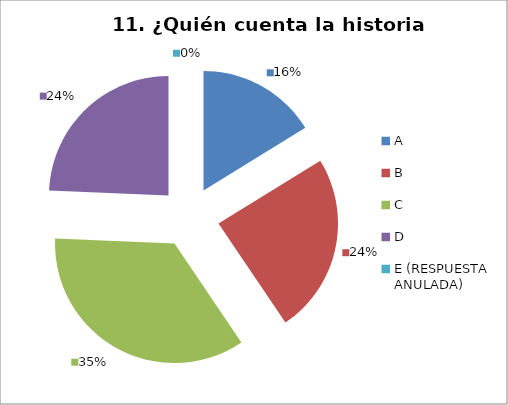
| Category | CANTIDAD DE RESPUESTAS PREGUNTA (11) | PORCENTAJE |
|---|---|---|
| A | 6 | 0.162 |
| B | 9 | 0.243 |
| C | 13 | 0.351 |
| D | 9 | 0.243 |
| E (RESPUESTA ANULADA) | 0 | 0 |